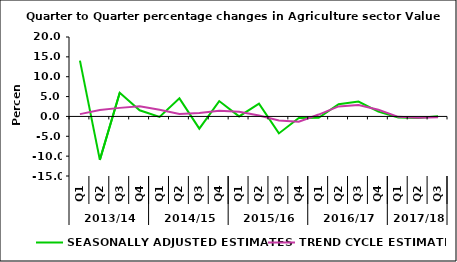
| Category | SEASONALLY ADJUSTED ESTIMATES | TREND CYCLE ESTIMATES |
|---|---|---|
| 0 | 14.048 | 0.578 |
| 1 | -10.932 | 1.622 |
| 2 | 5.947 | 2.153 |
| 3 | 1.539 | 2.579 |
| 4 | -0.131 | 1.695 |
| 5 | 4.55 | 0.619 |
| 6 | -3.077 | 0.877 |
| 7 | 3.866 | 1.422 |
| 8 | 0.004 | 1.173 |
| 9 | 3.222 | 0.252 |
| 10 | -4.279 | -1.009 |
| 11 | -0.382 | -1.351 |
| 12 | -0.329 | 0.47 |
| 13 | 3.058 | 2.522 |
| 14 | 3.744 | 2.882 |
| 15 | 1.202 | 1.68 |
| 16 | -0.261 | -0.099 |
| 17 | -0.426 | -0.363 |
| 18 | 0.056 | -0.182 |